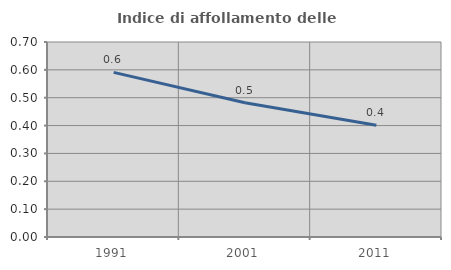
| Category | Indice di affollamento delle abitazioni  |
|---|---|
| 1991.0 | 0.591 |
| 2001.0 | 0.482 |
| 2011.0 | 0.401 |